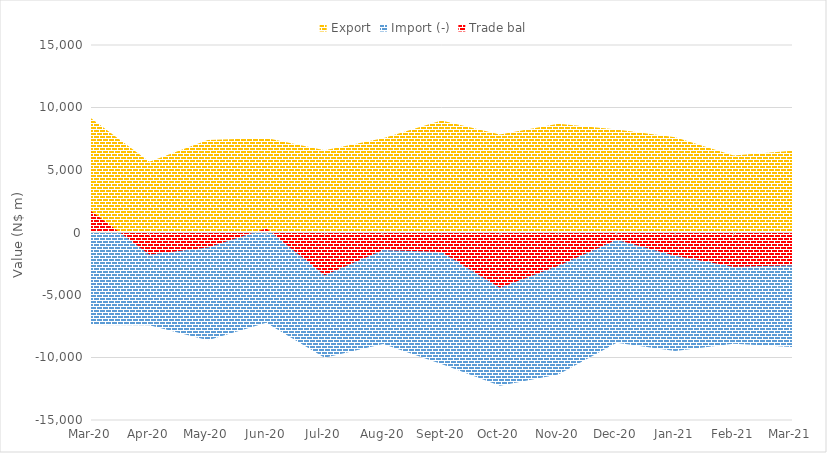
| Category | Export | Import (-) | Trade bal |
|---|---|---|---|
| 2020-03-01 | 9135.924 | -7407.82 | 1728.104 |
| 2020-04-01 | 5652.681 | -7419.971 | -1767.29 |
| 2020-05-01 | 7405.105 | -8613.109 | -1208.004 |
| 2020-06-01 | 7550.744 | -7225.655 | 325.089 |
| 2020-07-01 | 6582.778 | -10011.055 | -3428.277 |
| 2020-08-01 | 7530.921 | -8926.715 | -1395.794 |
| 2020-09-01 | 8956.329 | -10517.39 | -1561.06 |
| 2020-10-01 | 7839.288 | -12260.252 | -4420.964 |
| 2020-11-01 | 8692.896 | -11361.754 | -2668.858 |
| 2020-12-01 | 8235.063 | -8820.825 | -585.762 |
| 2021-01-01 | 7626.274 | -9480.486 | -1854.212 |
| 2021-02-01 | 6159.741 | -8890.181 | -2730.441 |
| 2021-03-01 | 6548.408 | -9168.198 | -2619.79 |